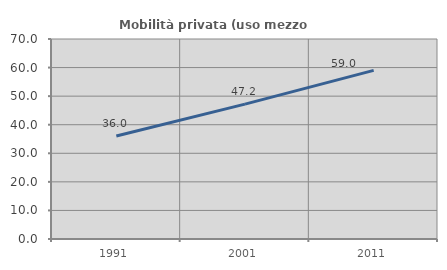
| Category | Mobilità privata (uso mezzo privato) |
|---|---|
| 1991.0 | 36.036 |
| 2001.0 | 47.191 |
| 2011.0 | 59.016 |